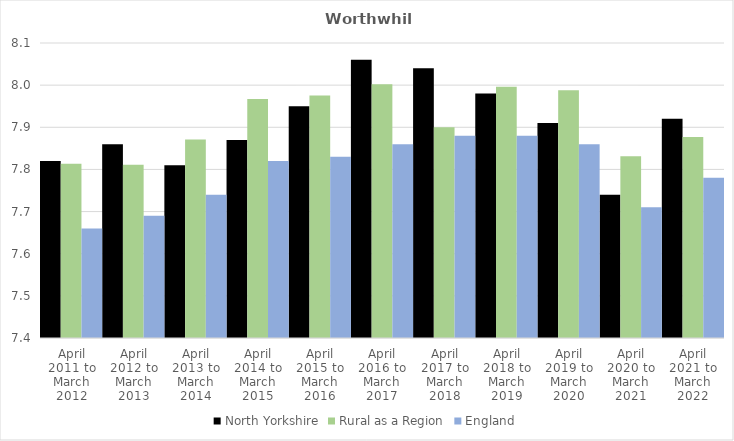
| Category | North Yorkshire | Rural as a Region | England |
|---|---|---|---|
| April 2011 to March 2012 | 7.82 | 7.813 | 7.66 |
| April 2012 to March 2013 | 7.86 | 7.811 | 7.69 |
| April 2013 to March 2014 | 7.81 | 7.871 | 7.74 |
| April 2014 to March 2015 | 7.87 | 7.967 | 7.82 |
| April 2015 to March 2016 | 7.95 | 7.975 | 7.83 |
| April 2016 to March 2017 | 8.06 | 8.002 | 7.86 |
| April 2017 to March 2018 | 8.04 | 7.9 | 7.88 |
| April 2018 to March 2019 | 7.98 | 7.996 | 7.88 |
| April 2019 to March 2020 | 7.91 | 7.988 | 7.86 |
| April 2020 to March 2021 | 7.74 | 7.831 | 7.71 |
| April 2021 to March 2022 | 7.92 | 7.877 | 7.78 |